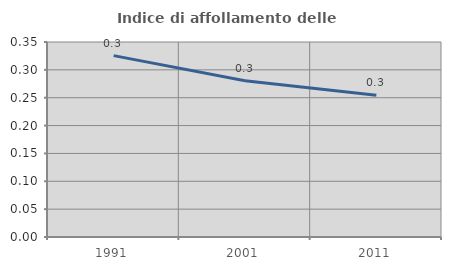
| Category | Indice di affollamento delle abitazioni  |
|---|---|
| 1991.0 | 0.326 |
| 2001.0 | 0.281 |
| 2011.0 | 0.254 |